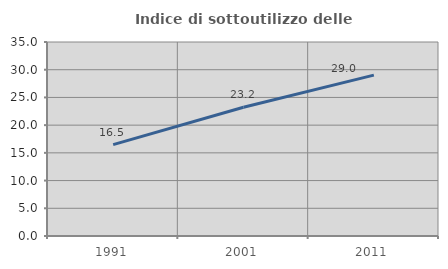
| Category | Indice di sottoutilizzo delle abitazioni  |
|---|---|
| 1991.0 | 16.479 |
| 2001.0 | 23.223 |
| 2011.0 | 29.022 |